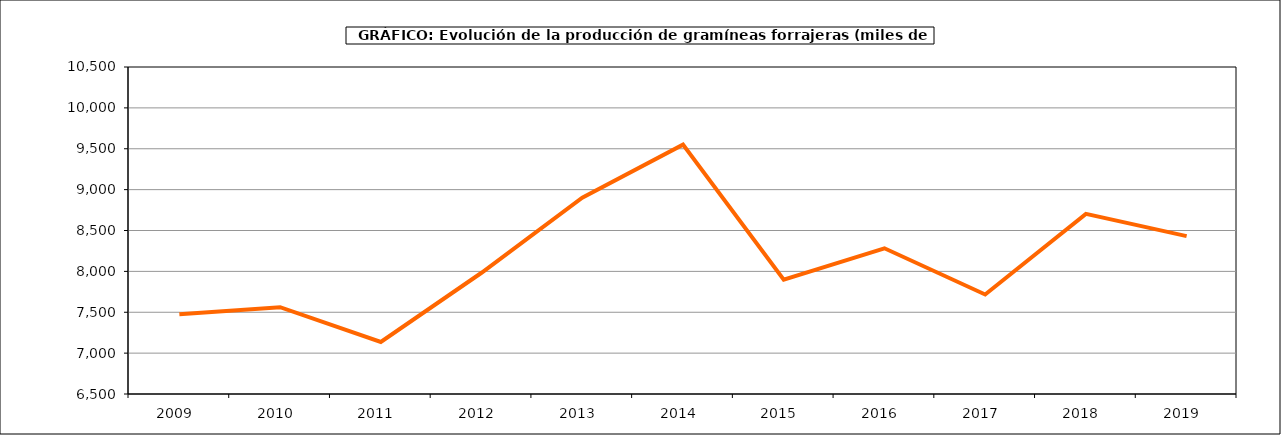
| Category | Superficie |
|---|---|
| 2009.0 | 7476.074 |
| 2010.0 | 7562.029 |
| 2011.0 | 7137.239 |
| 2012.0 | 7983.127 |
| 2013.0 | 8902.06 |
| 2014.0 | 9549.995 |
| 2015.0 | 7898.371 |
| 2016.0 | 8282.503 |
| 2017.0 | 7716.979 |
| 2018.0 | 8703.004 |
| 2019.0 | 8431.164 |